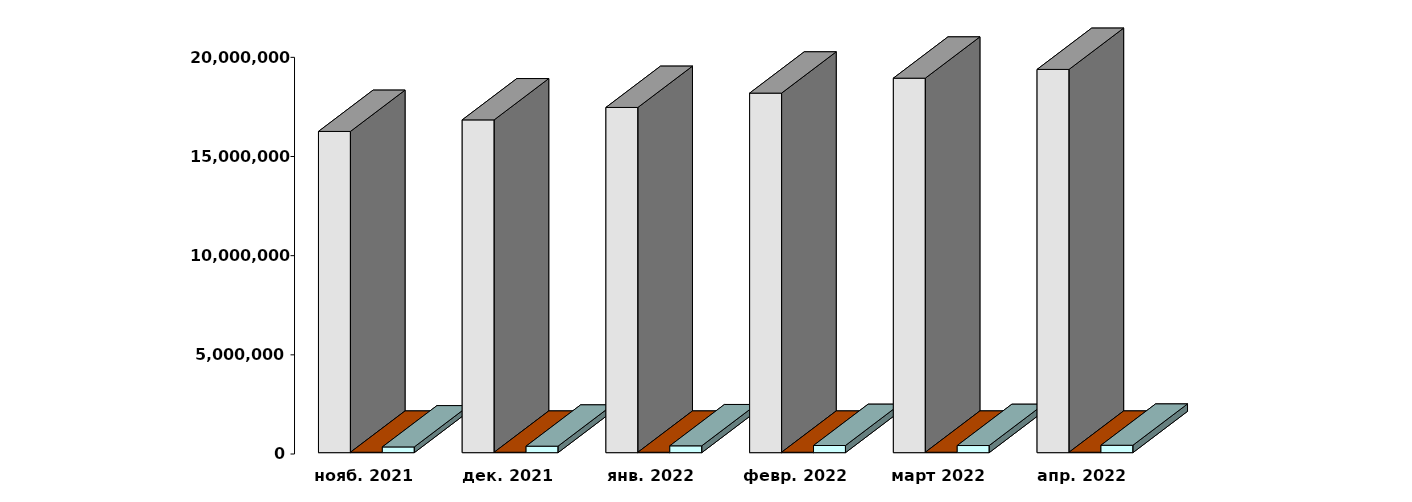
| Category | Физические лица | Юридические лица | Клиенты, передавшие свои средства в ДУ |
|---|---|---|---|
| 2021-11-28 | 16196130 | 20272 | 288895 |
| 2021-12-28 | 16779069 | 20446 | 327432 |
| 2022-01-28 | 17405817 | 20536 | 345411 |
| 2022-02-28 | 18128529 | 20698 | 361205 |
| 2022-03-30 | 18881687 | 21131 | 360205 |
| 2022-04-30 | 19323213 | 21524 | 374023 |